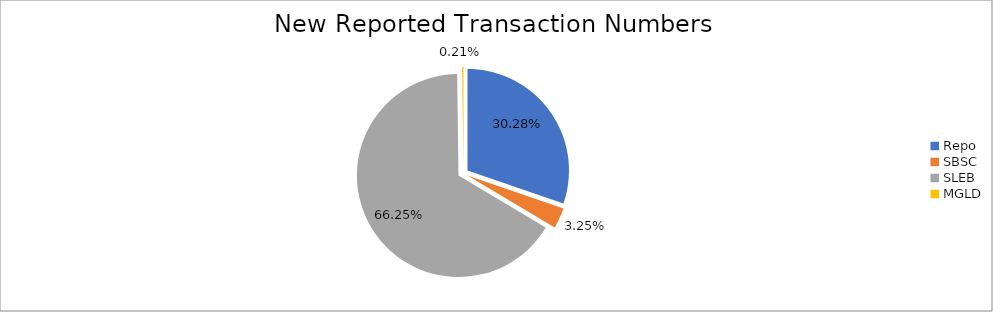
| Category | Series 0 |
|---|---|
| Repo | 413066 |
| SBSC | 44381 |
| SLEB | 903633 |
| MGLD | 2876 |